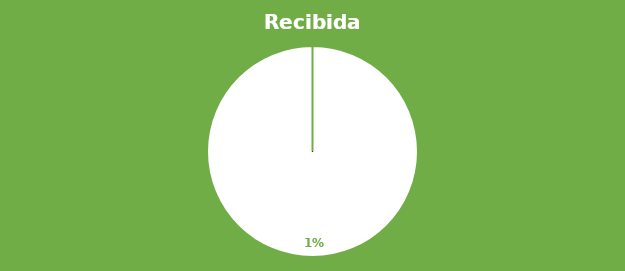
| Category | SOLICITUDES Atendidas |
|---|---|
| TOTAL | 3 |